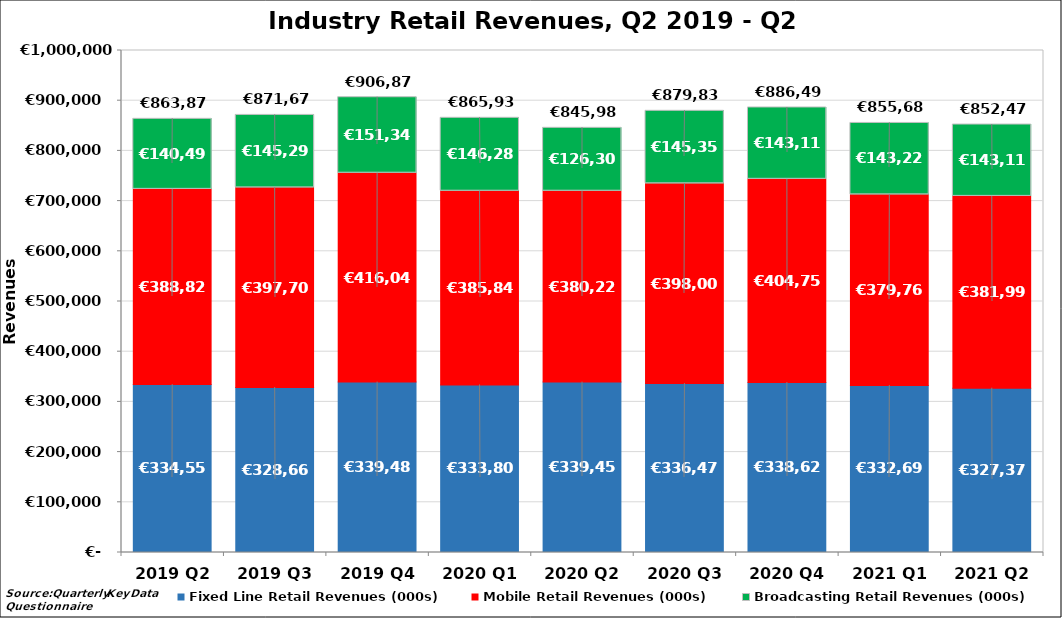
| Category | Fixed Line Retail Revenues (000s) | Mobile Retail Revenues (000s) | Broadcasting Retail Revenues (000s) |
|---|---|---|---|
| 2019 Q2 | 334555.661 | 388825.881 | 140493.699 |
| 2019 Q3 | 328666.506 | 397708.31 | 145297.666 |
| 2019 Q4 | 339487.178 | 416043.983 | 151346.492 |
| 2020 Q1 | 333808.414 | 385845.453 | 146283 |
| 2020 Q2 | 339452.93 | 380223 | 126307 |
| 2020 Q3 | 336479.251 | 398002 | 145352.467 |
| 2020 Q4 | 338628.139 | 404750.93 | 143115.932 |
| 2021 Q1 | 332692.883 | 379763.221 | 143225.728 |
| 2021 Q2 | 327371.946 | 381991.526 | 143113.892 |